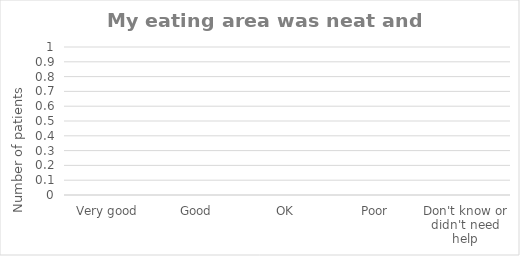
| Category | Series 3 |
|---|---|
| Very good | 0 |
| Good | 0 |
| OK | 0 |
| Poor | 0 |
| Don't know or didn't need help | 0 |